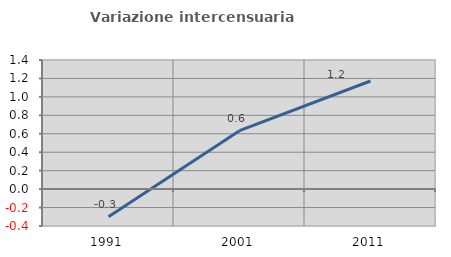
| Category | Variazione intercensuaria annua |
|---|---|
| 1991.0 | -0.3 |
| 2001.0 | 0.633 |
| 2011.0 | 1.172 |